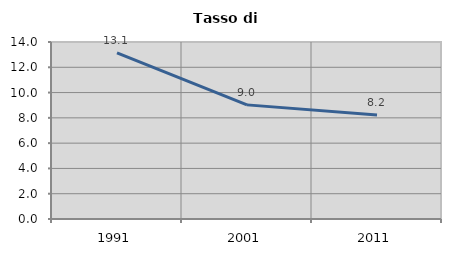
| Category | Tasso di disoccupazione   |
|---|---|
| 1991.0 | 13.141 |
| 2001.0 | 9.027 |
| 2011.0 | 8.219 |